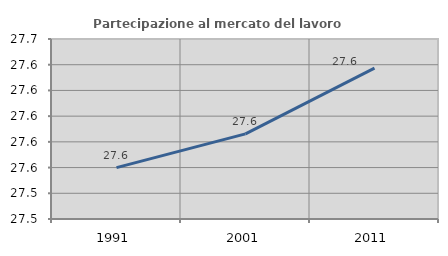
| Category | Partecipazione al mercato del lavoro  femminile |
|---|---|
| 1991.0 | 27.56 |
| 2001.0 | 27.586 |
| 2011.0 | 27.637 |